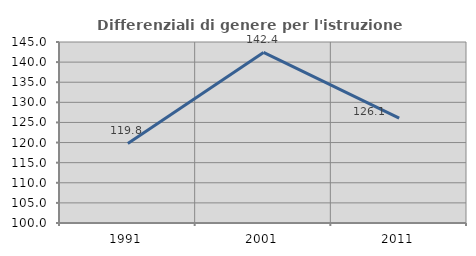
| Category | Differenziali di genere per l'istruzione superiore |
|---|---|
| 1991.0 | 119.791 |
| 2001.0 | 142.396 |
| 2011.0 | 126.079 |